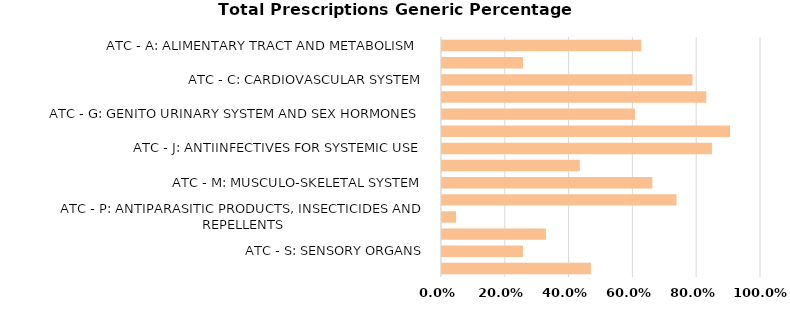
| Category | Total Prescriptions Generic Percentage |
|---|---|
| ATC - A: ALIMENTARY TRACT AND METABOLISM  | 0.625 |
| ATC - B: BLOOD AND BLOOD FORMING ORGANS | 0.254 |
| ATC - C: CARDIOVASCULAR SYSTEM | 0.785 |
| ATC - D: DERMATOLOGICALS | 0.828 |
| ATC - G: GENITO URINARY SYSTEM AND SEX HORMONES | 0.605 |
| ATC - H: SYSTEMIC HORMONAL PREPARATIONS, EXCL. SEX HORMONES AND INSULINS | 0.903 |
| ATC - J: ANTIINFECTIVES FOR SYSTEMIC USE | 0.846 |
| ATC - L: ANTINEOPLASTIC AND IMMUNOMODULATING AGENTS | 0.432 |
| ATC - M: MUSCULO-SKELETAL SYSTEM | 0.659 |
| ATC - N: NERVOUS SYSTEM | 0.735 |
| ATC - P: ANTIPARASITIC PRODUCTS, INSECTICIDES AND REPELLENTS | 0.044 |
| ATC - R: RESPIRATORY SYSTEM | 0.326 |
| ATC - S: SENSORY ORGANS | 0.254 |
| ATC - V: VARIOUS | 0.467 |